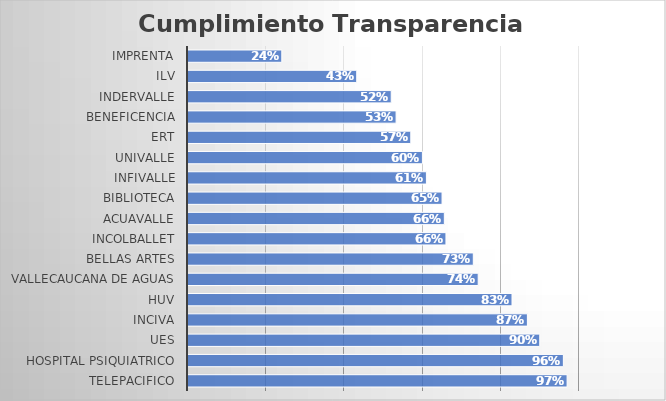
| Category | Total, Que Cumple |
|---|---|
| TELEPACIFICO | 0.97 |
| HOSPITAL PSIQUIATRICO | 0.96 |
| UES | 0.9 |
| INCIVA | 0.868 |
| HUV | 0.829 |
| VALLECAUCANA DE AGUAS | 0.742 |
| BELLAS ARTES | 0.73 |
| INCOLBALLET | 0.66 |
| ACUAVALLE | 0.656 |
| BIBLIOTECA | 0.65 |
| INFIVALLE | 0.61 |
| UNIVALLE | 0.6 |
| ERT | 0.57 |
| BENEFICENCIA | 0.532 |
| INDERVALLE | 0.52 |
| ILV | 0.432 |
| IMPRENTA | 0.24 |